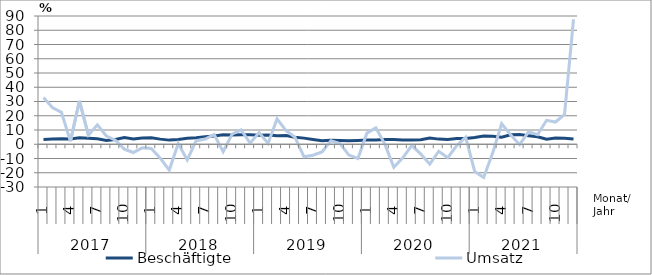
| Category | Beschäftigte | Umsatz |
|---|---|---|
| 0 | 3.3 | 32.8 |
| 1 | 3.6 | 25.7 |
| 2 | 3.9 | 22.4 |
| 3 | 3.7 | 2.1 |
| 4 | 4.6 | 30.4 |
| 5 | 4.2 | 6.4 |
| 6 | 3.8 | 13.7 |
| 7 | 2.7 | 5.8 |
| 8 | 3.3 | 2.8 |
| 9 | 4.7 | -3.4 |
| 10 | 3.7 | -5.8 |
| 11 | 4.4 | -2.5 |
| 12 | 4.5 | -3 |
| 13 | 3.6 | -9.8 |
| 14 | 2.9 | -18.1 |
| 15 | 3.4 | 0.5 |
| 16 | 4.2 | -11 |
| 17 | 4.5 | 2.5 |
| 18 | 5.3 | 3.7 |
| 19 | 5.8 | 6.8 |
| 20 | 6.6 | -5.2 |
| 21 | 6.5 | 7.1 |
| 22 | 6.6 | 10.1 |
| 23 | 6.6 | 0.8 |
| 24 | 6.4 | 8.2 |
| 25 | 6.5 | 0.6 |
| 26 | 6 | 17.8 |
| 27 | 6.1 | 9.6 |
| 28 | 4.9 | 4.9 |
| 29 | 4.3 | -8.8 |
| 30 | 3.3 | -7.7 |
| 31 | 2.4 | -5.4 |
| 32 | 2.8 | 2.4 |
| 33 | 2.7 | 0.5 |
| 34 | 2.5 | -7.6 |
| 35 | 2.7 | -10 |
| 36 | 2.9 | 7.8 |
| 37 | 2.9 | 11.5 |
| 38 | 3.4 | 0.1 |
| 39 | 3.4 | -16.1 |
| 40 | 2.9 | -9.5 |
| 41 | 2.9 | -0.8 |
| 42 | 3.1 | -6.9 |
| 43 | 4.3 | -14 |
| 44 | 3.6 | -4.9 |
| 45 | 3.4 | -9.4 |
| 46 | 4.1 | -0.9 |
| 47 | 4.1 | 4.9 |
| 48 | 4.8 | -19.1 |
| 49 | 5.8 | -23.3 |
| 50 | 5.6 | -6.1 |
| 51 | 5 | 14.4 |
| 52 | 6.6 | 6.6 |
| 53 | 6.9 | -0.3 |
| 54 | 6 | 8.7 |
| 55 | 5.2 | 6.7 |
| 56 | 3.6 | 16.8 |
| 57 | 4.3 | 15.6 |
| 58 | 4.2 | 20.9 |
| 59 | 3.7 | 87.7 |